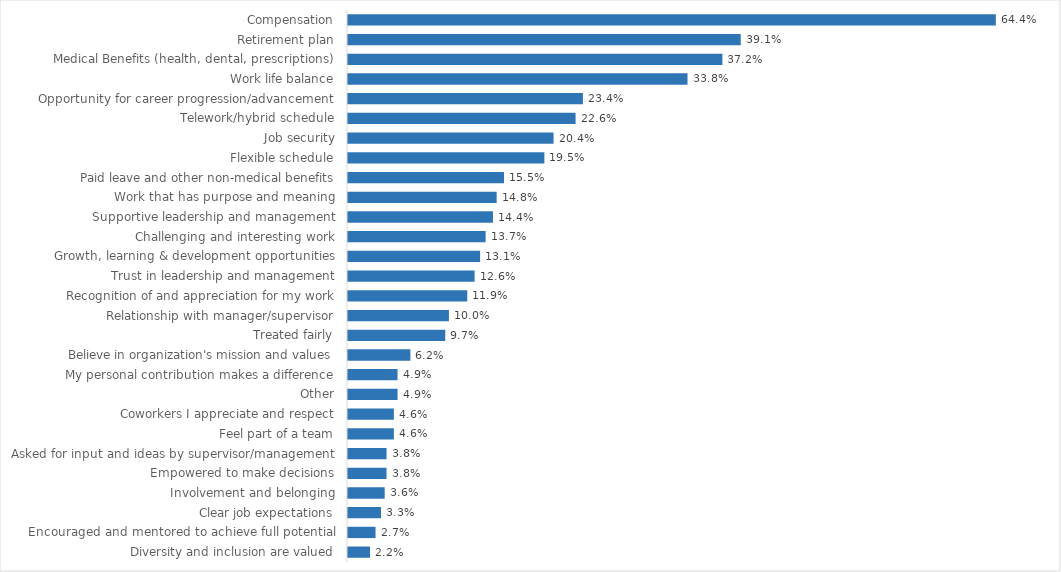
| Category | Transportation |
|---|---|
| Compensation | 0.644 |
| Retirement plan | 0.391 |
| Medical Benefits (health, dental, prescriptions) | 0.372 |
| Work life balance | 0.338 |
| Opportunity for career progression/advancement | 0.234 |
| Telework/hybrid schedule | 0.226 |
| Job security | 0.204 |
| Flexible schedule | 0.195 |
| Paid leave and other non-medical benefits | 0.155 |
| Work that has purpose and meaning | 0.148 |
| Supportive leadership and management | 0.144 |
| Challenging and interesting work | 0.137 |
| Growth, learning & development opportunities | 0.131 |
| Trust in leadership and management | 0.126 |
| Recognition of and appreciation for my work | 0.119 |
| Relationship with manager/supervisor | 0.1 |
| Treated fairly | 0.097 |
| Believe in organization's mission and values | 0.062 |
| My personal contribution makes a difference | 0.049 |
| Other | 0.049 |
| Coworkers I appreciate and respect | 0.046 |
| Feel part of a team | 0.046 |
| Asked for input and ideas by supervisor/management | 0.038 |
| Empowered to make decisions | 0.038 |
| Involvement and belonging | 0.036 |
| Clear job expectations | 0.033 |
| Encouraged and mentored to achieve full potential | 0.027 |
| Diversity and inclusion are valued | 0.022 |